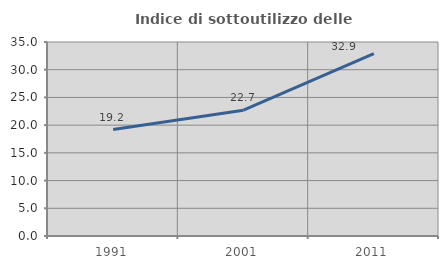
| Category | Indice di sottoutilizzo delle abitazioni  |
|---|---|
| 1991.0 | 19.2 |
| 2001.0 | 22.695 |
| 2011.0 | 32.907 |